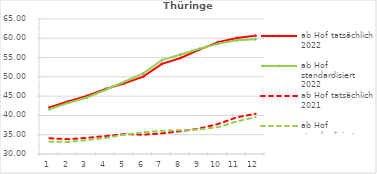
| Category | ab Hof tatsächlich 2022 | ab Hof standardisiert 2022 | ab Hof tatsächlich 2021 | ab Hof standardisiert 2021 |
|---|---|---|---|---|
| 0 | 42.082 | 41.592 | 34.075 | 33.208 |
| 1 | 43.631 | 43.243 | 33.847 | 33.118 |
| 2 | 45.061 | 44.656 | 34.171 | 33.598 |
| 3 | 46.866 | 46.646 | 34.653 | 34.151 |
| 4 | 48.309 | 48.73 | 35.149 | 35.006 |
| 5 | 50.051 | 50.88 | 35 | 35.581 |
| 6 | 53.361 | 54.337 | 35.349 | 36.039 |
| 7 | 54.886 | 55.787 | 35.917 | 36.177 |
| 8 | 57.05 | 57.285 | 36.59 | 36.389 |
| 9 | 59.007 | 58.619 | 37.773 | 36.951 |
| 10 | 60.069 | 59.477 | 39.523 | 38.453 |
| 11 | 60.688 | 59.747 | 40.426 | 39.552 |